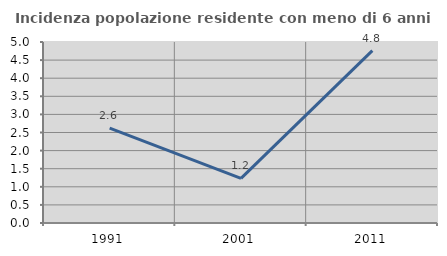
| Category | Incidenza popolazione residente con meno di 6 anni |
|---|---|
| 1991.0 | 2.622 |
| 2001.0 | 1.235 |
| 2011.0 | 4.762 |